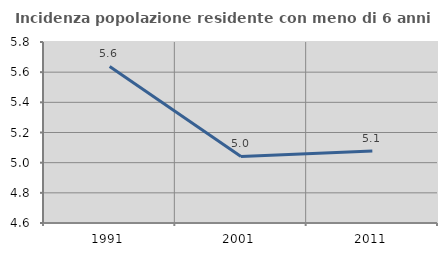
| Category | Incidenza popolazione residente con meno di 6 anni |
|---|---|
| 1991.0 | 5.638 |
| 2001.0 | 5.042 |
| 2011.0 | 5.077 |